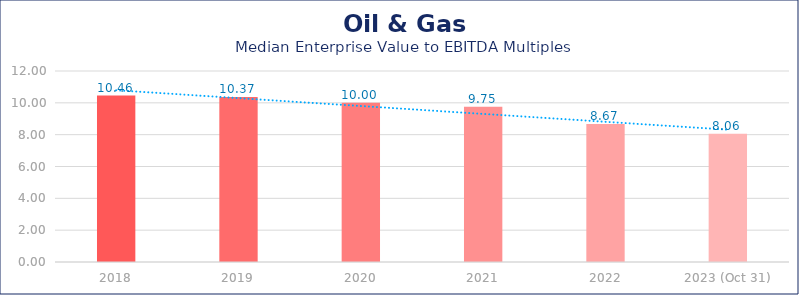
| Category | Oil & Gas |
|---|---|
| 2018 | 10.46 |
| 2019 | 10.37 |
| 2020 | 10 |
| 2021 | 9.75 |
| 2022 | 8.67 |
| 2023 (Oct 31) | 8.06 |